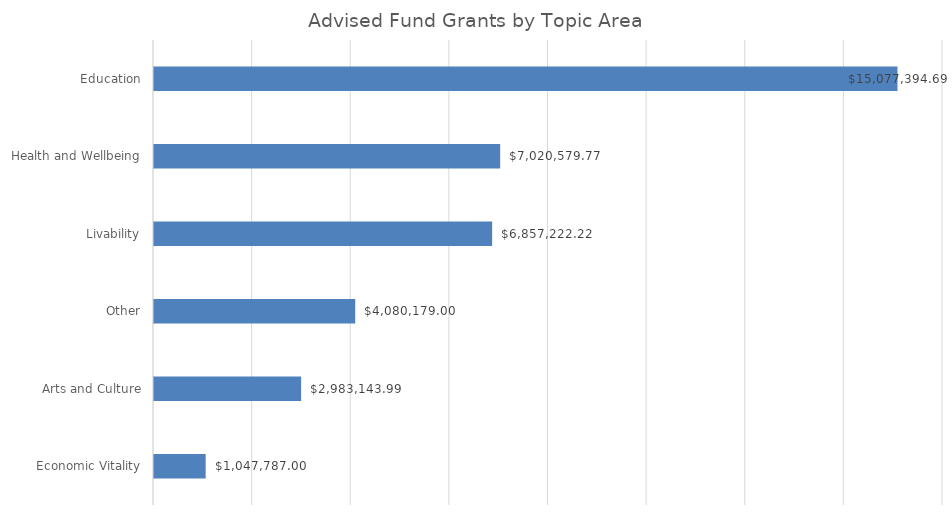
| Category | Number of Grants | Amount Awarded |
|---|---|---|
| Economic Vitality | 106 | 1047787 |
| Arts and Culture | 686 | 2983143.99 |
| Other | 293 | 4080179 |
| Livability | 1084 | 6857222.22 |
| Health and Wellbeing | 1332 | 7020579.77 |
| Education | 981 | 15077394.69 |